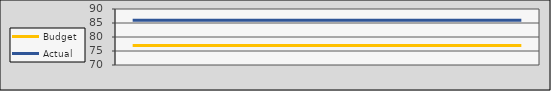
| Category | Budget | Actual |
|---|---|---|
| 2019-07-01 | 77 | 86 |
| 2019-08-01 | 77 | 86 |
| 2019-09-01 | 77 | 86 |
| 2019-10-02 | 77 | 86 |
| 2019-11-02 | 77 | 86 |
| 2019-12-03 | 77 | 86 |
| 2020-01-03 | 77 | 86 |
| 2020-02-03 | 77 | 86 |
| 2020-03-05 | 77 | 86 |
| 2020-04-05 | 77 | 86 |
| 2020-05-06 | 77 | 86 |
| 2020-06-06 | 77 | 86 |